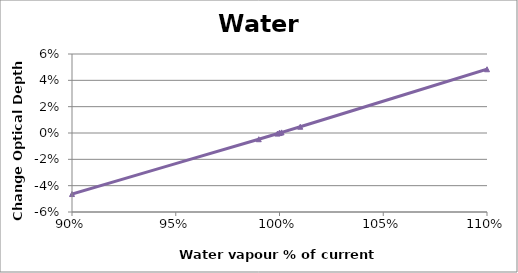
| Category | Series 3 |
|---|---|
| 0.9 | -0.046 |
| 0.99 | -0.005 |
| 0.999 | 0 |
| 0.9999 | 0 |
| 1.0001 | 0 |
| 1.001 | 0 |
| 1.01 | 0.005 |
| 1.1 | 0.048 |